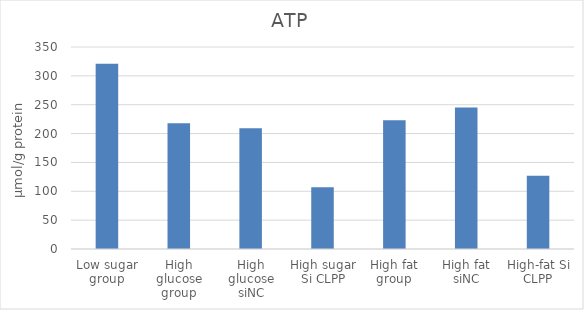
| Category | Series 0 |
|---|---|
| Low sugar group | 320.993 |
| High glucose group | 217.958 |
| High glucose siNC | 209.31 |
| High sugar Si CLPP | 107.077 |
| High fat group | 222.869 |
| High fat siNC | 245.372 |
| High-fat Si CLPP | 126.814 |